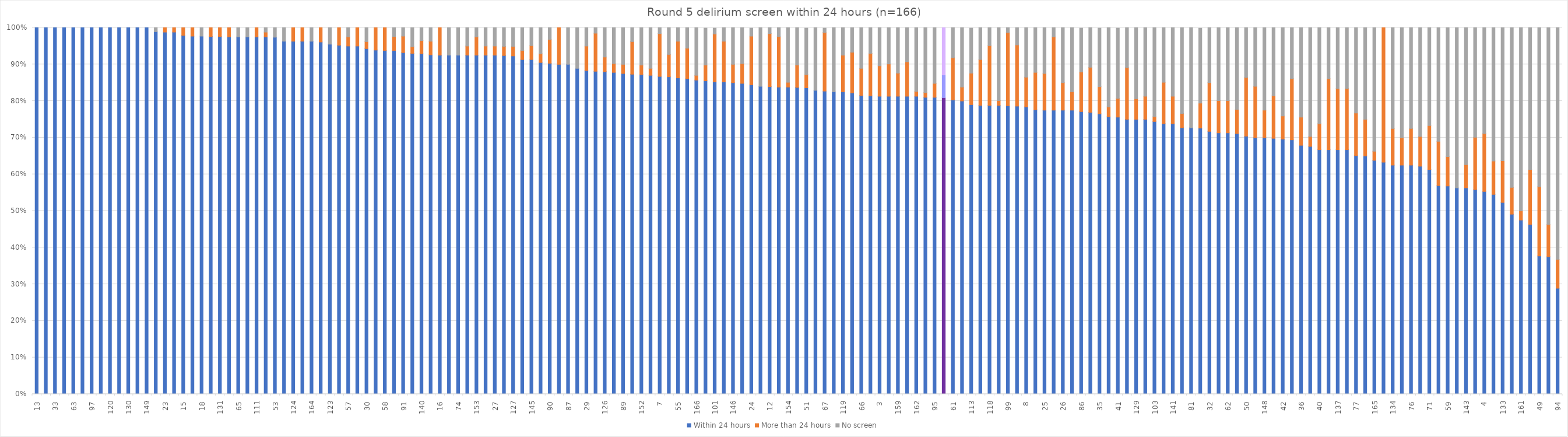
| Category | Within 24 hours | More than 24 hours | No screen |
|---|---|---|---|
| 13 | 1 | 0 | 0 |
| 17 | 1 | 0 | 0 |
| 33 | 1 | 0 | 0 |
| 47 | 1 | 0 | 0 |
| 63 | 1 | 0 | 0 |
| 68 | 1 | 0 | 0 |
| 97 | 1 | 0 | 0 |
| 110 | 1 | 0 | 0 |
| 120 | 1 | 0 | 0 |
| 125 | 1 | 0 | 0 |
| 130 | 1 | 0 | 0 |
| 144 | 1 | 0 | 0 |
| 149 | 1 | 0 | 0 |
| 85 | 0.989 | 0 | 0.011 |
| 23 | 0.988 | 0.013 | 0 |
| 96 | 0.988 | 0.013 | 0 |
| 15 | 0.979 | 0.021 | 0 |
| 14 | 0.977 | 0.023 | 0 |
| 18 | 0.977 | 0 | 0.023 |
| 104 | 0.976 | 0.024 | 0 |
| 131 | 0.976 | 0.024 | 0 |
| 54 | 0.975 | 0.025 | 0 |
| 65 | 0.975 | 0 | 0.025 |
| 72 | 0.975 | 0 | 0.025 |
| 111 | 0.975 | 0.025 | 0 |
| 112 | 0.975 | 0.013 | 0.013 |
| 53 | 0.974 | 0 | 0.026 |
| 116 | 0.963 | 0 | 0.038 |
| 124 | 0.963 | 0.037 | 0 |
| 135 | 0.963 | 0.038 | 0 |
| 164 | 0.963 | 0 | 0.038 |
| 108 | 0.961 | 0.039 | 0 |
| 123 | 0.955 | 0 | 0.045 |
| 38 | 0.952 | 0.048 | 0 |
| 57 | 0.95 | 0.025 | 0.025 |
| 83 | 0.95 | 0.05 | 0 |
| 30 | 0.943 | 0.019 | 0.038 |
| 98 | 0.939 | 0.061 | 0 |
| 58 | 0.938 | 0.063 | 0 |
| 106 | 0.938 | 0.038 | 0.025 |
| 91 | 0.932 | 0.045 | 0.023 |
| 60 | 0.93 | 0.018 | 0.053 |
| 140 | 0.929 | 0.036 | 0.036 |
| 105 | 0.926 | 0.037 | 0.037 |
| 16 | 0.925 | 0.075 | 0 |
| 34 | 0.925 | 0 | 0.075 |
| 74 | 0.925 | 0 | 0.075 |
| 82 | 0.925 | 0.025 | 0.05 |
| 153 | 0.925 | 0.05 | 0.025 |
| 157 | 0.925 | 0.025 | 0.05 |
| 27 | 0.925 | 0.025 | 0.05 |
| 44 | 0.924 | 0.025 | 0.051 |
| 127 | 0.923 | 0.026 | 0.051 |
| 73 | 0.913 | 0.025 | 0.063 |
| 145 | 0.913 | 0.038 | 0.05 |
| 132 | 0.905 | 0.024 | 0.071 |
| 90 | 0.903 | 0.065 | 0.032 |
| 48 | 0.9 | 0.1 | 0 |
| 87 | 0.9 | 0 | 0.1 |
| 142 | 0.889 | 0 | 0.111 |
| 29 | 0.883 | 0.067 | 0.05 |
| 92 | 0.881 | 0.104 | 0.015 |
| 126 | 0.88 | 0.04 | 0.08 |
| 136 | 0.878 | 0.024 | 0.098 |
| 89 | 0.875 | 0.025 | 0.1 |
| 69 | 0.873 | 0.089 | 0.038 |
| 152 | 0.872 | 0.026 | 0.103 |
| 64 | 0.87 | 0.019 | 0.111 |
| 7 | 0.867 | 0.117 | 0.017 |
| 80 | 0.866 | 0.061 | 0.073 |
| 55 | 0.863 | 0.1 | 0.038 |
| 1 | 0.861 | 0.083 | 0.056 |
| 166 | 0.857 | 0.013 | 0.13 |
| 78 | 0.855 | 0.043 | 0.101 |
| 101 | 0.852 | 0.131 | 0.016 |
| 107 | 0.852 | 0.111 | 0.037 |
| 146 | 0.85 | 0.05 | 0.1 |
| 37 | 0.848 | 0.054 | 0.098 |
| 24 | 0.844 | 0.133 | 0.022 |
| 88 | 0.84 | 0 | 0.16 |
| 12 | 0.839 | 0.145 | 0.016 |
| 121 | 0.838 | 0.138 | 0.025 |
| 154 | 0.838 | 0.013 | 0.15 |
| 109 | 0.837 | 0.061 | 0.102 |
| 51 | 0.836 | 0.036 | 0.127 |
| 9 | 0.829 | 0 | 0.171 |
| 67 | 0.827 | 0.16 | 0.012 |
| 45 | 0.825 | 0 | 0.175 |
| 119 | 0.825 | 0.1 | 0.075 |
| 39 | 0.822 | 0.111 | 0.067 |
| 66 | 0.815 | 0.074 | 0.111 |
| 31 | 0.814 | 0.116 | 0.07 |
| 3 | 0.813 | 0.083 | 0.104 |
| 117 | 0.813 | 0.088 | 0.1 |
| 159 | 0.813 | 0.063 | 0.125 |
| 160 | 0.813 | 0.094 | 0.094 |
| 162 | 0.813 | 0.013 | 0.175 |
| 56 | 0.81 | 0.013 | 0.177 |
| 95 | 0.81 | 0.038 | 0.152 |
| TNS | 0.809 | 0.062 | 0.129 |
| 61 | 0.803 | 0.115 | 0.082 |
| 114 | 0.8 | 0.038 | 0.163 |
| 113 | 0.79 | 0.086 | 0.123 |
| 79 | 0.788 | 0.125 | 0.088 |
| 118 | 0.788 | 0.163 | 0.05 |
| 163 | 0.788 | 0.013 | 0.2 |
| 99 | 0.787 | 0.2 | 0.013 |
| 21 | 0.786 | 0.167 | 0.048 |
| 8 | 0.784 | 0.081 | 0.135 |
| 28 | 0.776 | 0.102 | 0.122 |
| 25 | 0.775 | 0.1 | 0.125 |
| 158 | 0.775 | 0.2 | 0.025 |
| 26 | 0.775 | 0.075 | 0.15 |
| 147 | 0.775 | 0.05 | 0.175 |
| 86 | 0.771 | 0.108 | 0.12 |
| 43 | 0.769 | 0.123 | 0.108 |
| 35 | 0.765 | 0.074 | 0.16 |
| 10 | 0.757 | 0.027 | 0.216 |
| 41 | 0.756 | 0.051 | 0.192 |
| 52 | 0.75 | 0.141 | 0.109 |
| 129 | 0.75 | 0.056 | 0.194 |
| 156 | 0.75 | 0.063 | 0.188 |
| 103 | 0.744 | 0.013 | 0.244 |
| 70 | 0.738 | 0.113 | 0.15 |
| 141 | 0.738 | 0.075 | 0.188 |
| 19 | 0.727 | 0.039 | 0.234 |
| 81 | 0.727 | 0 | 0.273 |
| 155 | 0.726 | 0.068 | 0.205 |
| 32 | 0.717 | 0.133 | 0.15 |
| 22 | 0.713 | 0.088 | 0.2 |
| 62 | 0.713 | 0.088 | 0.2 |
| 139 | 0.711 | 0.066 | 0.224 |
| 50 | 0.704 | 0.16 | 0.136 |
| 138 | 0.7 | 0.14 | 0.16 |
| 148 | 0.7 | 0.075 | 0.225 |
| 2 | 0.698 | 0.116 | 0.186 |
| 42 | 0.696 | 0.063 | 0.241 |
| 5 | 0.694 | 0.167 | 0.139 |
| 36 | 0.679 | 0.077 | 0.244 |
| 6 | 0.676 | 0.027 | 0.297 |
| 40 | 0.667 | 0.071 | 0.262 |
| 128 | 0.667 | 0.194 | 0.139 |
| 137 | 0.667 | 0.167 | 0.167 |
| 46 | 0.667 | 0.167 | 0.167 |
| 77 | 0.651 | 0.116 | 0.233 |
| 102 | 0.65 | 0.1 | 0.25 |
| 165 | 0.638 | 0.025 | 0.338 |
| 75 | 0.633 | 0.367 | 0 |
| 134 | 0.625 | 0.1 | 0.275 |
| 122 | 0.625 | 0.075 | 0.3 |
| 76 | 0.625 | 0.1 | 0.275 |
| 11 | 0.622 | 0.081 | 0.297 |
| 71 | 0.613 | 0.12 | 0.267 |
| 93 | 0.569 | 0.121 | 0.31 |
| 59 | 0.568 | 0.08 | 0.352 |
| 115 | 0.563 | 0 | 0.438 |
| 143 | 0.563 | 0.063 | 0.375 |
| 150 | 0.558 | 0.143 | 0.299 |
| 4 | 0.553 | 0.158 | 0.289 |
| 100 | 0.545 | 0.091 | 0.364 |
| 133 | 0.523 | 0.114 | 0.364 |
| 151 | 0.491 | 0.073 | 0.436 |
| 161 | 0.475 | 0.025 | 0.5 |
| 84 | 0.463 | 0.15 | 0.388 |
| 49 | 0.377 | 0.189 | 0.434 |
| 20 | 0.375 | 0.088 | 0.538 |
| 94 | 0.289 | 0.079 | 0.632 |